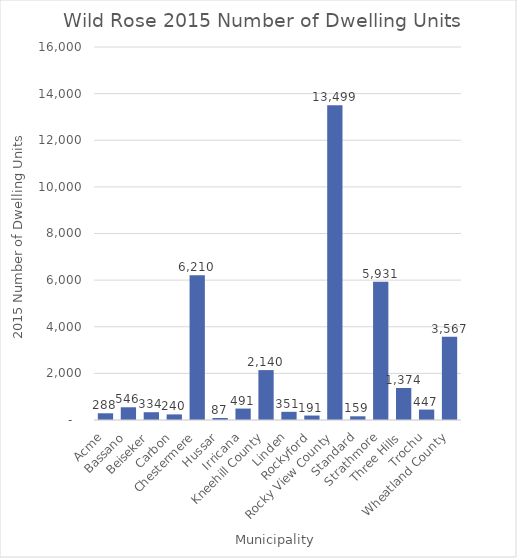
| Category | 2015 Number of Dwelling Units |
|---|---|
| Acme | 288 |
| Bassano | 546 |
| Beiseker | 334 |
| Carbon | 240 |
| Chestermere | 6210 |
| Hussar | 87 |
| Irricana | 491 |
| Kneehill County | 2140 |
| Linden | 351 |
| Rockyford | 191 |
| Rocky View County | 13499 |
| Standard | 159 |
| Strathmore | 5931 |
| Three Hills | 1374 |
| Trochu | 447 |
| Wheatland County | 3567 |